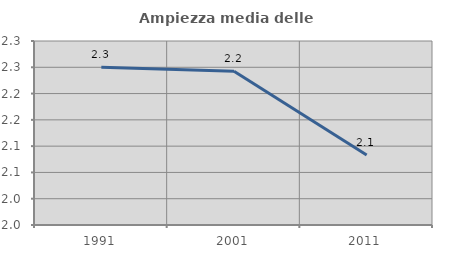
| Category | Ampiezza media delle famiglie |
|---|---|
| 1991.0 | 2.25 |
| 2001.0 | 2.243 |
| 2011.0 | 2.083 |